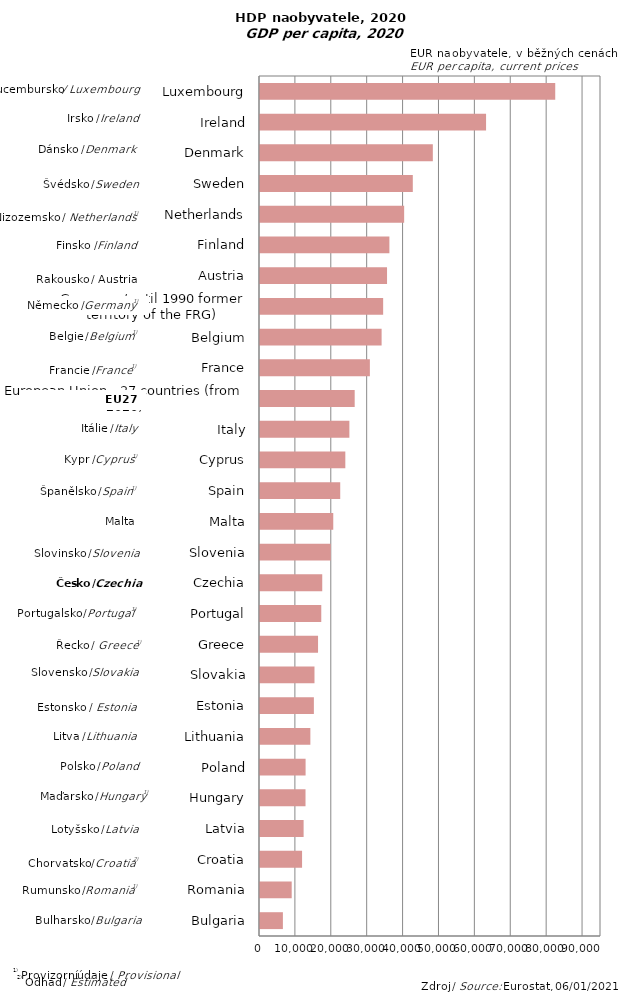
| Category | Series 0 |
|---|---|
| Bulgaria | 6380 |
| Romania | 8830 |
| Croatia | 11720 |
| Latvia | 12150 |
| Hungary | 12680 |
| Poland | 12700 |
| Lithuania | 14030 |
| Estonia | 15010 |
| Slovakia | 15180 |
| Greece | 16170 |
| Portugal | 17070 |
| Czechia | 17340 |
| Slovenia | 19720 |
| Malta | 20410 |
| Spain | 22350 |
| Cyprus | 23770 |
| Italy | 24900 |
| European Union - 27 countries (from 2020) | 26380 |
| France | 30610 |
| Belgium | 33880 |
| Germany (until 1990 former territory of the FRG) | 34310 |
| Austria | 35390 |
| Finland | 36050 |
| Netherlands | 40160 |
| Sweden | 42570 |
| Denmark | 48150 |
| Ireland | 62980 |
| Luxembourg | 82250 |